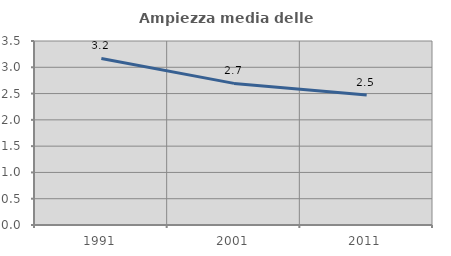
| Category | Ampiezza media delle famiglie |
|---|---|
| 1991.0 | 3.168 |
| 2001.0 | 2.694 |
| 2011.0 | 2.474 |